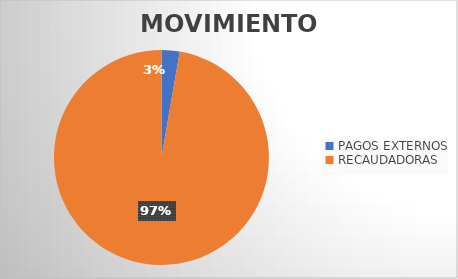
| Category | MOVIMIENTOS |
|---|---|
| PAGOS EXTERNOS | 504 |
| RECAUDADORAS | 18024 |